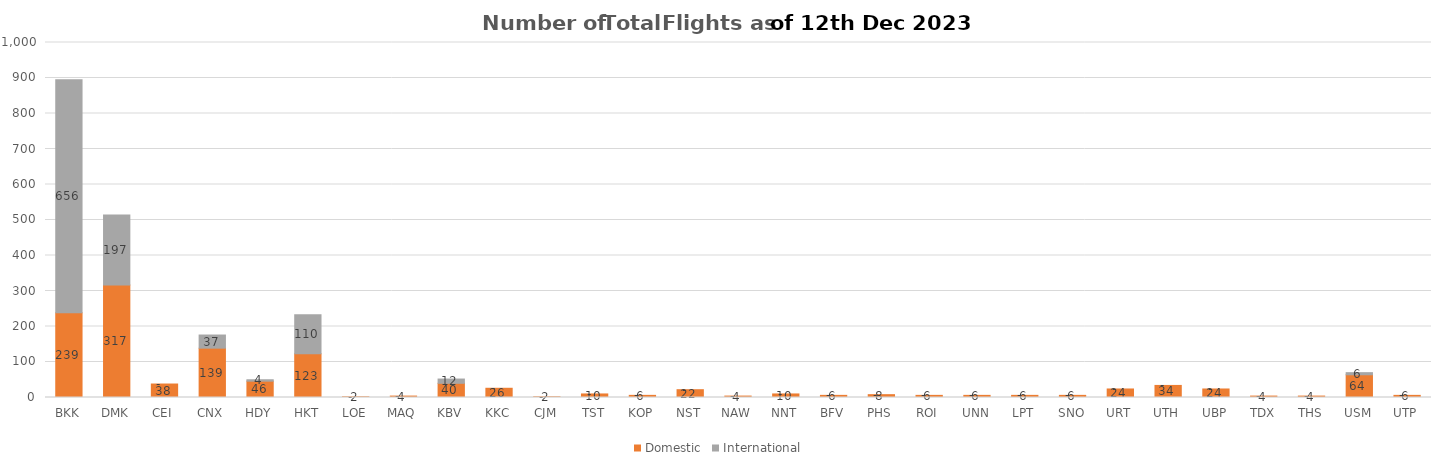
| Category | Domestic | International |
|---|---|---|
| BKK | 239 | 656 |
| DMK | 317 | 197 |
| CEI | 38 | 0 |
| CNX | 139 | 37 |
| HDY | 46 | 4 |
| HKT | 123 | 110 |
| LOE | 2 | 0 |
| MAQ | 4 | 0 |
| KBV | 40 | 12 |
| KKC | 26 | 0 |
| CJM | 2 | 0 |
| TST | 10 | 0 |
| KOP | 6 | 0 |
| NST | 22 | 0 |
| NAW | 4 | 0 |
| NNT | 10 | 0 |
| BFV | 6 | 0 |
| PHS | 8 | 0 |
| ROI | 6 | 0 |
| UNN | 6 | 0 |
| LPT | 6 | 0 |
| SNO | 6 | 0 |
| URT | 24 | 0 |
| UTH | 34 | 0 |
| UBP | 24 | 0 |
| TDX | 4 | 0 |
| THS | 4 | 0 |
| USM | 64 | 6 |
| UTP | 6 | 0 |